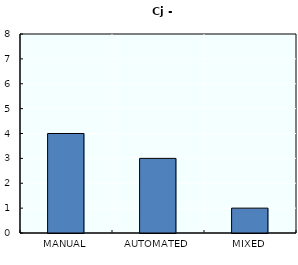
| Category | Series 0 |
|---|---|
| MANUAL | 4 |
| AUTOMATED | 3 |
| MIXED | 1 |